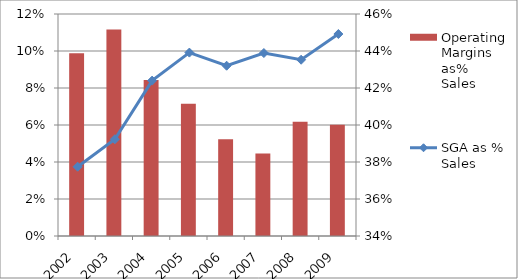
| Category | Operating Margins as% Sales |
|---|---|
| 2002.0 | 0.099 |
| 2003.0 | 0.112 |
| 2004.0 | 0.084 |
| 2005.0 | 0.071 |
| 2006.0 | 0.052 |
| 2007.0 | 0.045 |
| 2008.0 | 0.062 |
| 2009.0 | 0.06 |